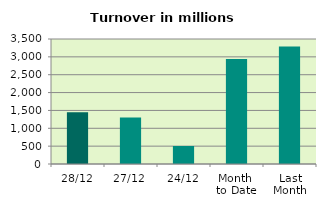
| Category | Series 0 |
|---|---|
| 28/12 | 1451.658 |
| 27/12 | 1304.289 |
| 24/12 | 504.448 |
| Month 
to Date | 2939.641 |
| Last
Month | 3292.145 |